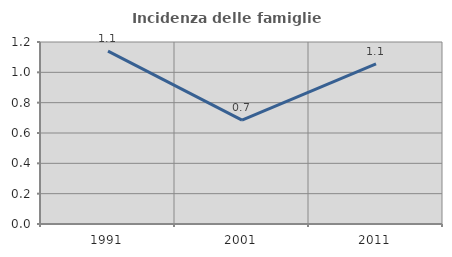
| Category | Incidenza delle famiglie numerose |
|---|---|
| 1991.0 | 1.14 |
| 2001.0 | 0.684 |
| 2011.0 | 1.055 |